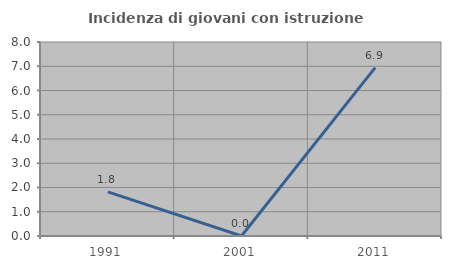
| Category | Incidenza di giovani con istruzione universitaria |
|---|---|
| 1991.0 | 1.818 |
| 2001.0 | 0 |
| 2011.0 | 6.944 |